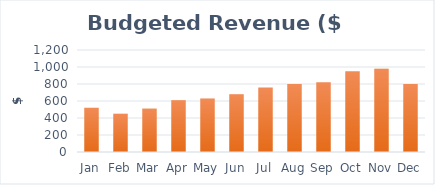
| Category | Budgeted Revenue ($ 000's) |
|---|---|
| Jan | 520 |
| Feb | 450 |
| Mar | 510 |
| Apr | 610 |
| May | 630 |
| Jun | 680 |
| Jul | 760 |
| Aug | 800 |
| Sep | 820 |
| Oct | 950 |
| Nov | 980 |
| Dec | 800 |